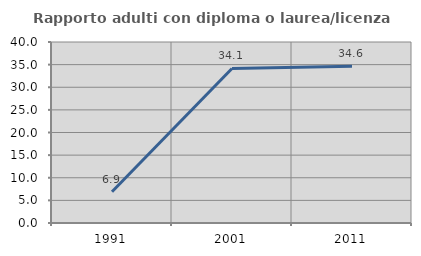
| Category | Rapporto adulti con diploma o laurea/licenza media  |
|---|---|
| 1991.0 | 6.897 |
| 2001.0 | 34.146 |
| 2011.0 | 34.615 |